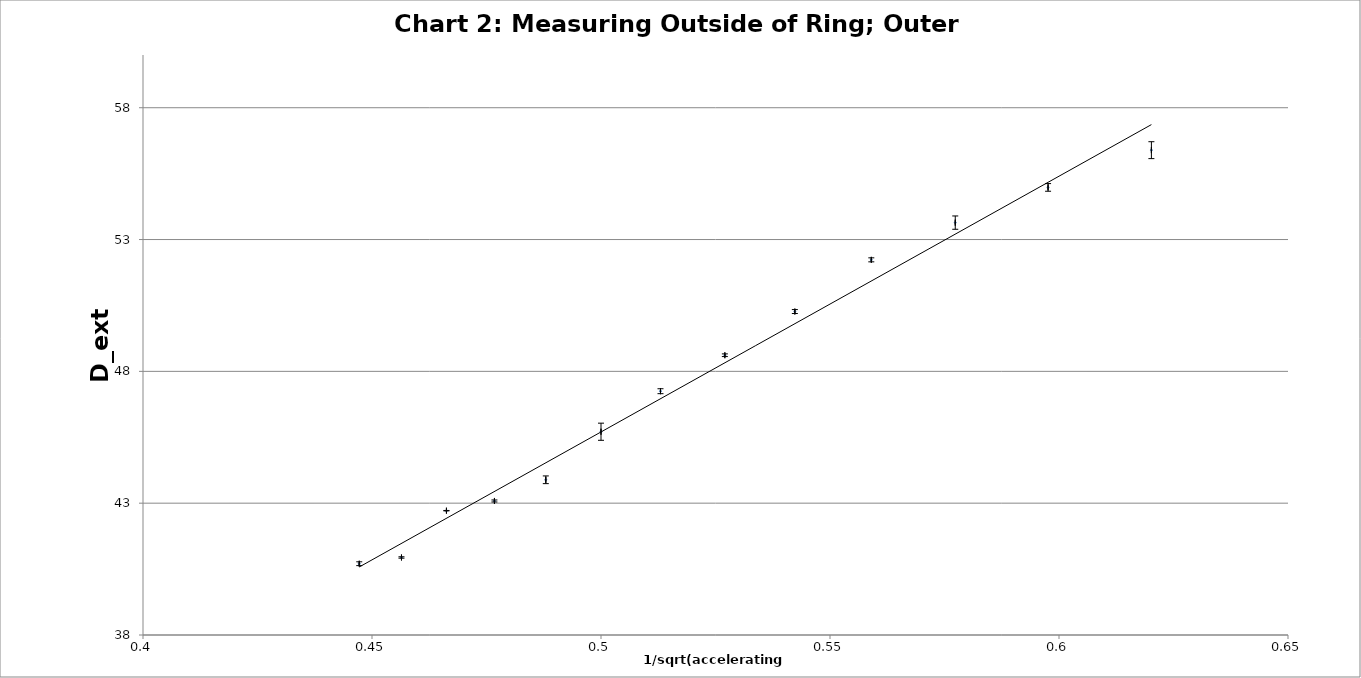
| Category | Measuring Outside of Ring; Outer Ring |
|---|---|
| 0.4472135954999579 | 40.704 |
| 0.45643546458763845 | 40.941 |
| 0.4662524041201569 | 42.716 |
| 0.4767312946227961 | 43.084 |
| 0.48795003647426655 | 43.887 |
| 0.5 | 45.71 |
| 0.5129891760425771 | 47.248 |
| 0.5270462766947299 | 48.612 |
| 0.5423261445466404 | 50.269 |
| 0.5590169943749475 | 52.23 |
| 0.5773502691896258 | 53.642 |
| 0.5976143046671968 | 54.977 |
| 0.6201736729460422 | 56.391 |